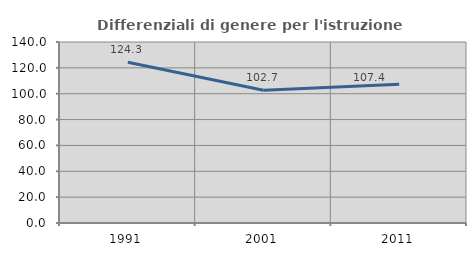
| Category | Differenziali di genere per l'istruzione superiore |
|---|---|
| 1991.0 | 124.325 |
| 2001.0 | 102.702 |
| 2011.0 | 107.396 |